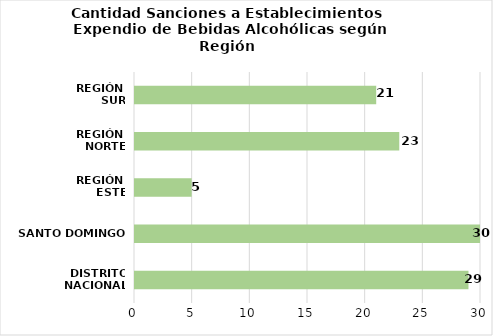
| Category | Series 0 |
|---|---|
| DISTRITO NACIONAL | 29 |
| SANTO DOMINGO | 30 |
| REGIÓN 
ESTE | 5 |
| REGIÓN 
NORTE | 23 |
| REGIÓN 
SUR | 21 |